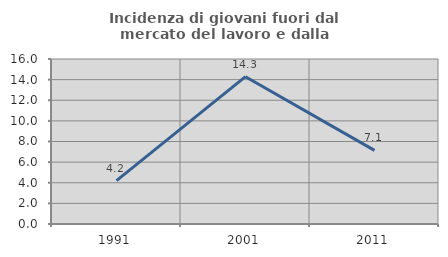
| Category | Incidenza di giovani fuori dal mercato del lavoro e dalla formazione  |
|---|---|
| 1991.0 | 4.211 |
| 2001.0 | 14.286 |
| 2011.0 | 7.143 |